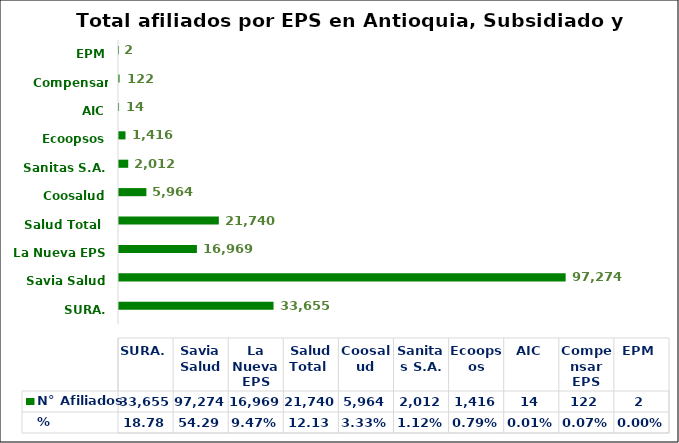
| Category | % | N° Afiliados |
|---|---|---|
| SURA. | 0.188 | 33655 |
| Savia Salud | 0.543 | 97274 |
| La Nueva EPS | 0.095 | 16969 |
| Salud Total  | 0.121 | 21740 |
| Coosalud | 0.033 | 5964 |
| Sanitas S.A. | 0.011 | 2012 |
| Ecoopsos | 0.008 | 1416 |
| AIC | 0 | 14 |
| Compensar EPS | 0.001 | 122 |
| EPM | 0 | 2 |